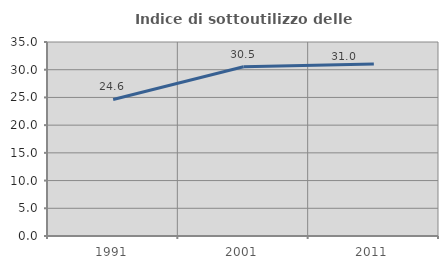
| Category | Indice di sottoutilizzo delle abitazioni  |
|---|---|
| 1991.0 | 24.632 |
| 2001.0 | 30.542 |
| 2011.0 | 31.038 |